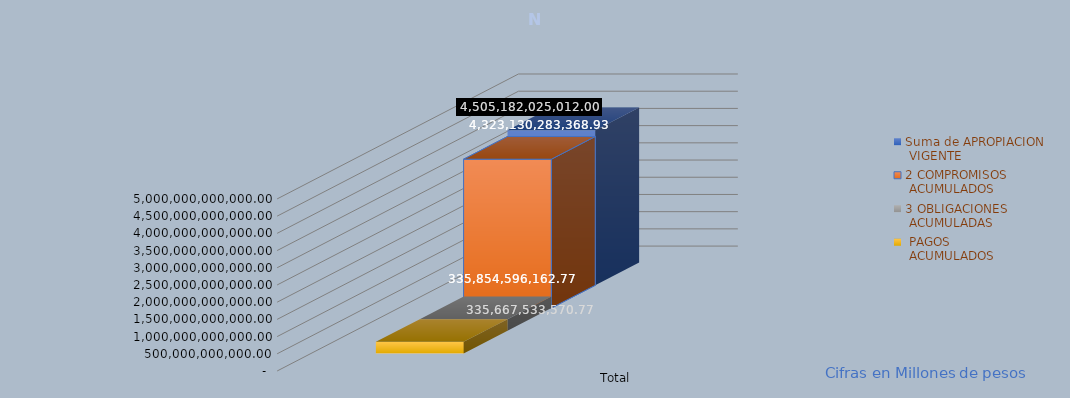
| Category | Suma de APROPIACION
 VIGENTE | 2 COMPROMISOS
 ACUMULADOS | 3 OBLIGACIONES
 ACUMULADAS |  PAGOS
 ACUMULADOS |
|---|---|---|---|---|
| Total | 4505182025012 | 4323130283368.93 | 335854596162.77 | 335667533570.77 |